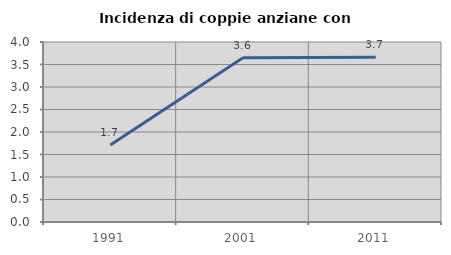
| Category | Incidenza di coppie anziane con figli |
|---|---|
| 1991.0 | 1.713 |
| 2001.0 | 3.648 |
| 2011.0 | 3.659 |